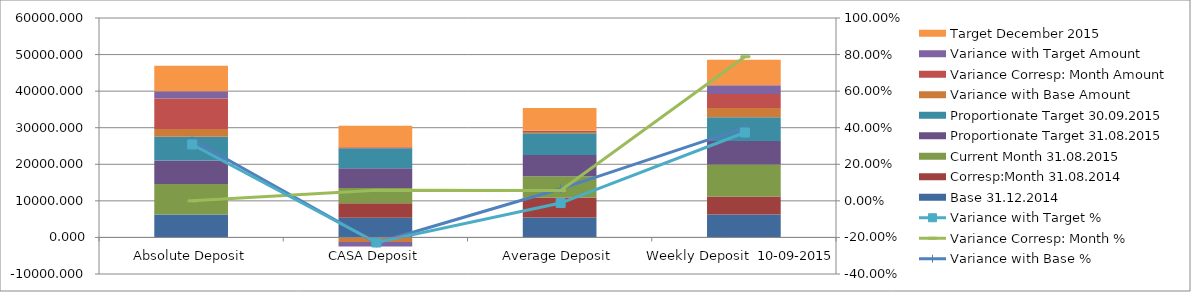
| Category | Base 31.12.2014 | Corresp:Month 31.08.2014 | Current Month 31.08.2015 | Proportionate Target 31.08.2015 | Proportionate Target 30.09.2015 | Variance with Base Amount  | Variance Corresp: Month Amount | Variance with Target Amount | Target December 2015 |
|---|---|---|---|---|---|---|---|---|---|
| Absolute Deposit | 6266.495 | 0 | 8359.874 | 6389.109 | 6526.867 | 2093.379 | 8359.874 | 1970.765 | 6966.227 |
| CASA Deposit | 5407.551 | 3934.188 | 4160.844 | 5387.456 | 5507.375 | -1246.707 | 226.656 | -1226.612 | 5893.219 |
| Average Deposit | 5433.827 | 5482.24 | 5791.833 | 5862.533 | 5930.529 | 358.006 | 309.593 | -70.7 | 6206.57 |
| Weekly Deposit  10-09-2015 | 6266.495 | 4908.91 | 8776.695 | 6389.109 | 6526.867 | 2510.2 | 3867.785 | 2387.586 | 6966.227 |